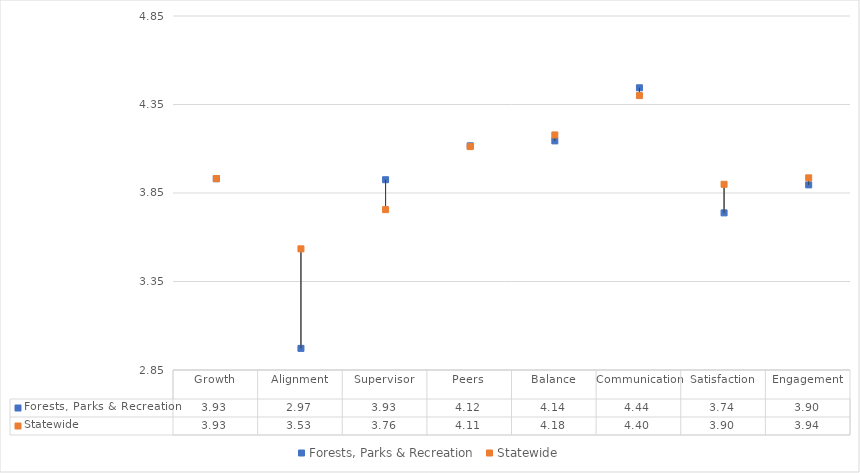
| Category | Forests, Parks & Recreation | Statewide |
|---|---|---|
| Growth | 3.931 | 3.931 |
| Alignment | 2.972 | 3.534 |
| Supervisor | 3.925 | 3.756 |
| Peers | 4.117 | 4.112 |
| Balance | 4.144 | 4.178 |
| Communication | 4.444 | 4.4 |
| Satisfaction | 3.738 | 3.899 |
| Engagement | 3.896 | 3.936 |